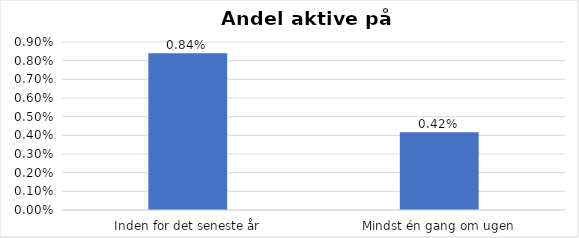
| Category | % |
|---|---|
| Inden for det seneste år | 0.008 |
| Mindst én gang om ugen | 0.004 |